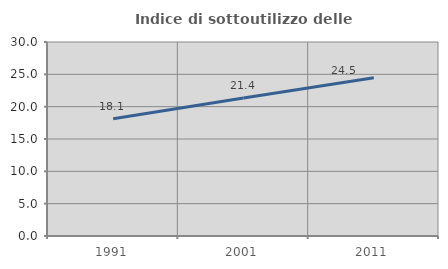
| Category | Indice di sottoutilizzo delle abitazioni  |
|---|---|
| 1991.0 | 18.141 |
| 2001.0 | 21.354 |
| 2011.0 | 24.477 |